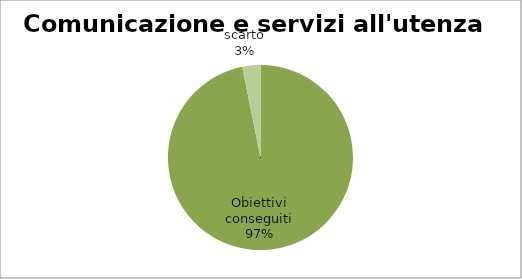
| Category | Series 0 |
|---|---|
| Obiettivi conseguiti | 96.829 |
| scarto | 3.171 |